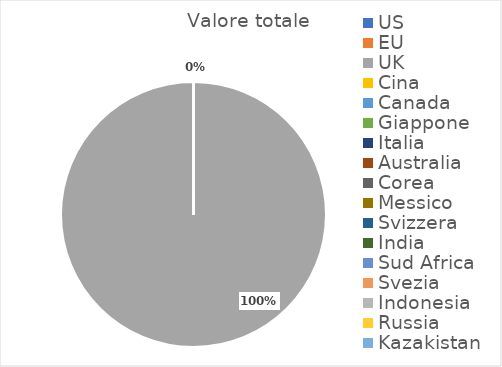
| Category | Valore totale |
|---|---|
| US | 0 |
| EU | 0 |
| UK | 3827.55 |
| Cina | 0 |
| Canada | 0 |
| Giappone | 0 |
| Italia | 0 |
| Australia | 0 |
| Corea | 0 |
| Messico | 0 |
| Svizzera | 0 |
| India | 0 |
| Sud Africa | 0 |
| Svezia | 0 |
| Indonesia | 0 |
| Russia | 0 |
| Kazakistan | 0 |